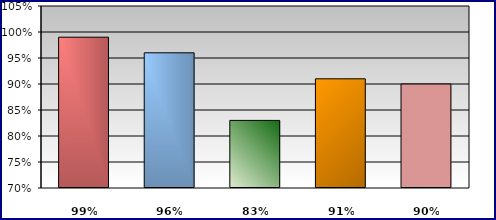
| Category | Series 0 | Series 1 | Series 2 | Series 3 |
|---|---|---|---|---|
| 0 | 0.99 |  |  |  |
| 1 | 0.96 |  |  |  |
| 2 | 0.83 |  |  |  |
| 3 | 0.91 |  |  |  |
| 4 | 0.9 |  |  |  |